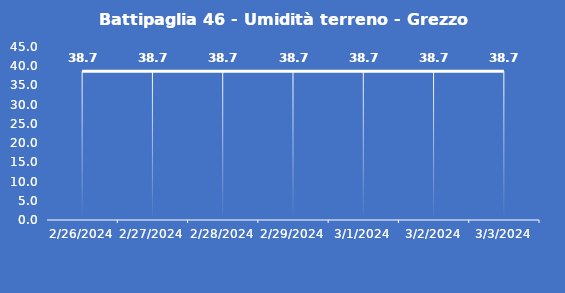
| Category | Battipaglia 46 - Umidità terreno - Grezzo (%VWC) |
|---|---|
| 2/26/24 | 38.7 |
| 2/27/24 | 38.7 |
| 2/28/24 | 38.7 |
| 2/29/24 | 38.7 |
| 3/1/24 | 38.7 |
| 3/2/24 | 38.7 |
| 3/3/24 | 38.7 |